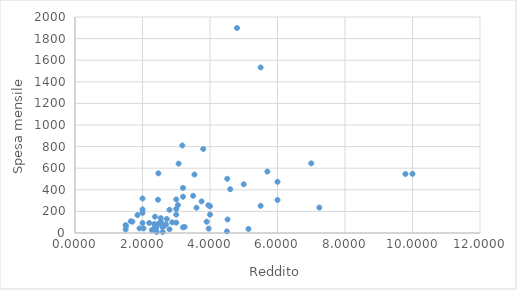
| Category | Series 0 |
|---|---|
| 4.52 | 124.98 |
| 2.42 | 9.85 |
| 4.5 | 15 |
| 2.54 | 137.87 |
| 9.79 | 546.5 |
| 2.5 | 92 |
| 3.96 | 40.83 |
| 2.37 | 150.79 |
| 3.8 | 777.82 |
| 3.2 | 52.58 |
| 3.95 | 256.66 |
| 2.45 | 78.87 |
| 1.91 | 42.62 |
| 3.2 | 335.43 |
| 4.0 | 248.72 |
| 10.0 | 548.03 |
| 2.35 | 43.34 |
| 2.0 | 218.52 |
| 4.0 | 170.64 |
| 5.14 | 37.58 |
| 4.51 | 502.2 |
| 1.5 | 73.18 |
| 5.5 | 1532.77 |
| 2.03 | 42.69 |
| 3.2 | 417.83 |
| 2.47 | 552.72 |
| 3.0 | 222.54 |
| 3.54 | 541.3 |
| 5.7 | 568.77 |
| 3.5 | 344.47 |
| 4.6 | 405.35 |
| 3.0 | 310.94 |
| 2.59 | 53.65 |
| 1.51 | 63.92 |
| 1.85 | 165.85 |
| 2.6 | 9.58 |
| 2.0 | 319.49 |
| 2.35 | 83.08 |
| 7.0 | 644.83 |
| 2.0 | 93.2 |
| 1.7 | 105.04 |
| 2.8 | 34.13 |
| 2.4 | 41.19 |
| 3.0 | 169.89 |
| 4.8 | 1898.03 |
| 3.18 | 810.39 |
| 1.5 | 32.78 |
| 3.0 | 95.8 |
| 2.28 | 27.78 |
| 2.8 | 215.07 |
| 2.7 | 79.51 |
| 6.0 | 306.03 |
| 3.9 | 104.54 |
| 3.07 | 642.47 |
| 2.46 | 308.05 |
| 2.0 | 186.35 |
| 3.25 | 56.15 |
| 2.72 | 129.37 |
| 2.2 | 93.11 |
| 3.75 | 292.66 |
| 2.88 | 98.46 |
| 3.05 | 258.55 |
| 2.55 | 101.68 |
| 2.64 | 65.25 |
| 1.65 | 108.61 |
| 2.4 | 49.56 |
| 7.24 | 235.57 |
| 2.4 | 68.38 |
| 6.0 | 474.15 |
| 3.6 | 234.05 |
| 5.0 | 451.2 |
| 5.5 | 251.52 |